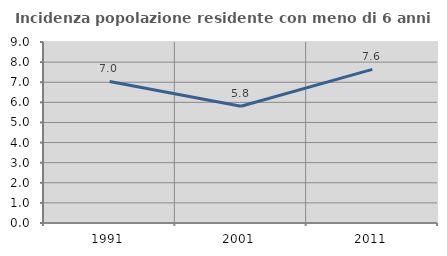
| Category | Incidenza popolazione residente con meno di 6 anni |
|---|---|
| 1991.0 | 7.039 |
| 2001.0 | 5.806 |
| 2011.0 | 7.637 |